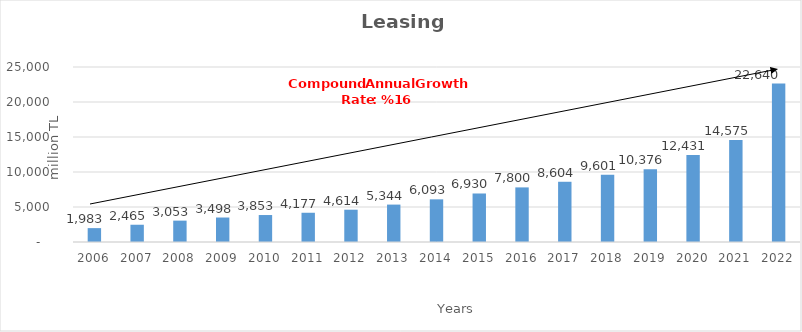
| Category | Leasing |
|---|---|
| 2006.0 | 1982.831 |
| 2007.0 | 2465.488 |
| 2008.0 | 3052.714 |
| 2009.0 | 3497.62 |
| 2010.0 | 3853.173 |
| 2011.0 | 4177.309 |
| 2012.0 | 4614.29 |
| 2013.0 | 5344.41 |
| 2014.0 | 6093 |
| 2015.0 | 6930 |
| 2016.0 | 7800 |
| 2017.0 | 8604 |
| 2018.0 | 9601 |
| 2019.0 | 10376 |
| 2020.0 | 12431 |
| 2021.0 | 14575 |
| 2022.0 | 22640 |